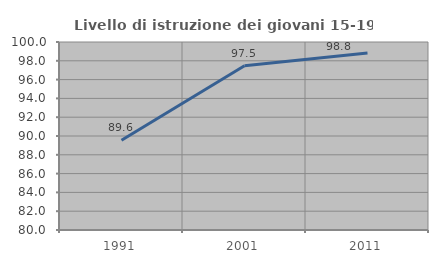
| Category | Livello di istruzione dei giovani 15-19 anni |
|---|---|
| 1991.0 | 89.552 |
| 2001.0 | 97.483 |
| 2011.0 | 98.825 |